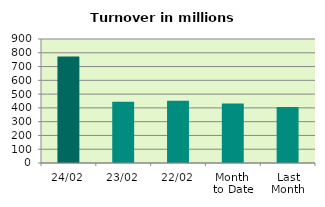
| Category | Series 0 |
|---|---|
| 24/02 | 773.289 |
| 23/02 | 445.445 |
| 22/02 | 451.273 |
| Month 
to Date | 431.004 |
| Last
Month | 406.741 |